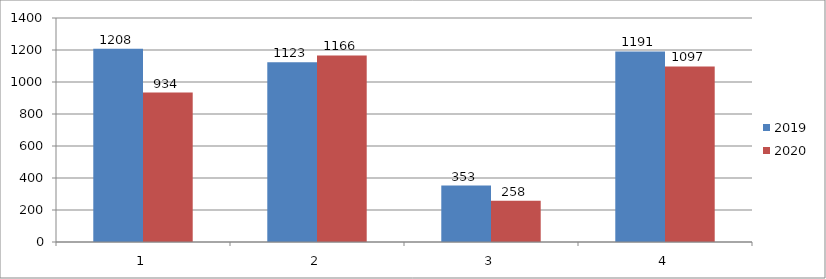
| Category | 2019 | 2020 |
|---|---|---|
| 0 | 1208 | 934 |
| 1 | 1123 | 1166 |
| 2 | 353 | 258 |
| 3 | 1191 | 1097 |